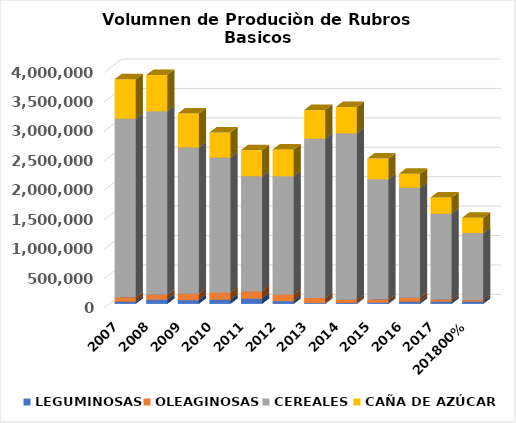
| Category | LEGUMINOSAS | OLEAGINOSAS | CEREALES | CAÑA DE AZÚCAR |
|---|---|---|---|---|
| 2007.0 | 37108 | 75962 | 3033710 | 672213.9 |
| 2008.0 | 73736 | 80952 | 3118464 | 617361.742 |
| 2009.0 | 64946 | 106420 | 2486000 | 577500 |
| 2010.0 | 70871 | 123609 | 2290000 | 427500 |
| 2011.0 | 88646 | 128180 | 1950510 | 446539.125 |
| 2012.0 | 47851 | 110226 | 2009547 | 457500 |
| 2013.0 | 14788 | 86566 | 2705000 | 488250 |
| 2014.0 | 17068 | 55343 | 2825389 | 448060.425 |
| 2015.0 | 22607 | 50658 | 2044250 | 352500 |
| 2016.0 | 37192.419 | 66553 | 1869960 | 238068.75 |
| 2017.0 | 38560.553 | 37865 | 1455000 | 277500 |
| 2018.0 | 40488.58 | 24965 | 1139000 | 258750 |